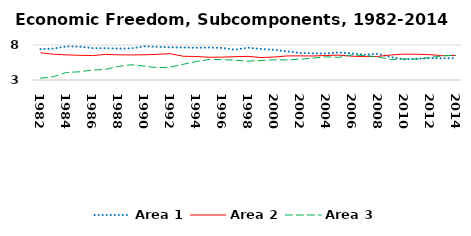
| Category | Area 1 | Area 2 | Area 3 |
|---|---|---|---|
| 1982.0 | 7.425 | 6.883 | 3.259 |
| 1983.0 | 7.487 | 6.687 | 3.477 |
| 1984.0 | 7.805 | 6.588 | 4.072 |
| 1985.0 | 7.769 | 6.528 | 4.176 |
| 1986.0 | 7.552 | 6.485 | 4.422 |
| 1987.0 | 7.547 | 6.657 | 4.511 |
| 1988.0 | 7.489 | 6.595 | 4.941 |
| 1989.0 | 7.521 | 6.587 | 5.176 |
| 1990.0 | 7.811 | 6.599 | 4.997 |
| 1991.0 | 7.75 | 6.668 | 4.754 |
| 1992.0 | 7.672 | 6.765 | 4.838 |
| 1993.0 | 7.64 | 6.393 | 5.244 |
| 1994.0 | 7.606 | 6.359 | 5.629 |
| 1995.0 | 7.64 | 6.25 | 5.928 |
| 1996.0 | 7.579 | 6.264 | 5.926 |
| 1997.0 | 7.334 | 6.333 | 5.815 |
| 1998.0 | 7.612 | 6.376 | 5.699 |
| 1999.0 | 7.431 | 6.21 | 5.792 |
| 2000.0 | 7.323 | 6.281 | 5.877 |
| 2001.0 | 7.09 | 6.436 | 5.873 |
| 2002.0 | 6.856 | 6.447 | 5.971 |
| 2003.0 | 6.818 | 6.432 | 6.121 |
| 2004.0 | 6.779 | 6.5 | 6.313 |
| 2005.0 | 6.929 | 6.554 | 6.232 |
| 2006.0 | 6.801 | 6.4 | 6.588 |
| 2007.0 | 6.608 | 6.338 | 6.494 |
| 2008.0 | 6.751 | 6.365 | 6.311 |
| 2009.0 | 6.283 | 6.571 | 5.922 |
| 2010.0 | 5.937 | 6.692 | 6.016 |
| 2011.0 | 6.041 | 6.681 | 5.966 |
| 2012.0 | 6.134 | 6.622 | 6.19 |
| 2013.0 | 6.097 | 6.475 | 6.457 |
| 2014.0 | 6.13 | 6.512 | 6.522 |